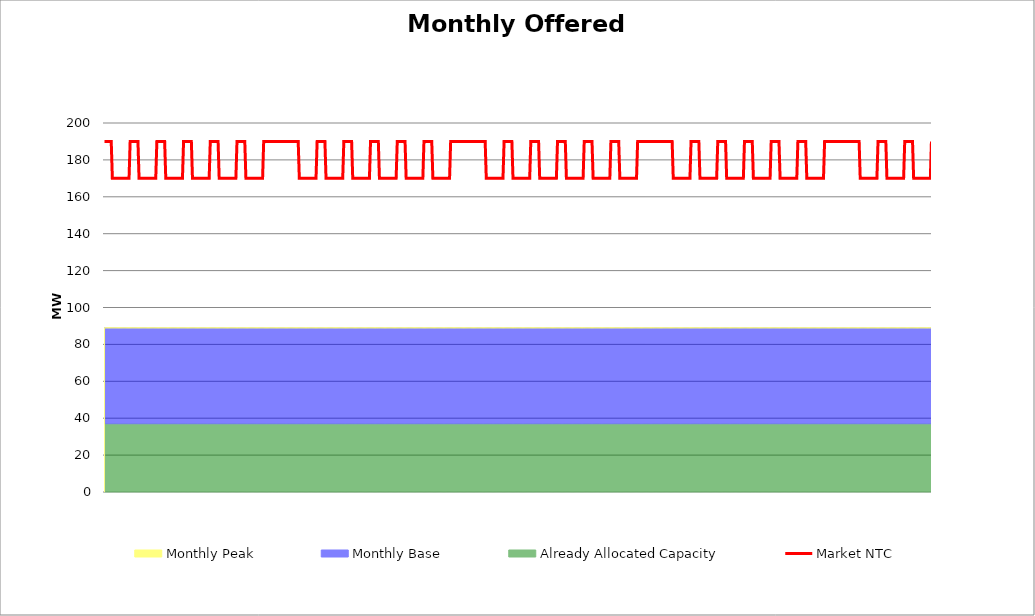
| Category | Market NTC |
|---|---|
| 0 | 190 |
| 1 | 190 |
| 2 | 190 |
| 3 | 190 |
| 4 | 190 |
| 5 | 190 |
| 6 | 190 |
| 7 | 170 |
| 8 | 170 |
| 9 | 170 |
| 10 | 170 |
| 11 | 170 |
| 12 | 170 |
| 13 | 170 |
| 14 | 170 |
| 15 | 170 |
| 16 | 170 |
| 17 | 170 |
| 18 | 170 |
| 19 | 170 |
| 20 | 170 |
| 21 | 170 |
| 22 | 170 |
| 23 | 190 |
| 24 | 190 |
| 25 | 190 |
| 26 | 190 |
| 27 | 190 |
| 28 | 190 |
| 29 | 190 |
| 30 | 190 |
| 31 | 170 |
| 32 | 170 |
| 33 | 170 |
| 34 | 170 |
| 35 | 170 |
| 36 | 170 |
| 37 | 170 |
| 38 | 170 |
| 39 | 170 |
| 40 | 170 |
| 41 | 170 |
| 42 | 170 |
| 43 | 170 |
| 44 | 170 |
| 45 | 170 |
| 46 | 170 |
| 47 | 190 |
| 48 | 190 |
| 49 | 190 |
| 50 | 190 |
| 51 | 190 |
| 52 | 190 |
| 53 | 190 |
| 54 | 190 |
| 55 | 170 |
| 56 | 170 |
| 57 | 170 |
| 58 | 170 |
| 59 | 170 |
| 60 | 170 |
| 61 | 170 |
| 62 | 170 |
| 63 | 170 |
| 64 | 170 |
| 65 | 170 |
| 66 | 170 |
| 67 | 170 |
| 68 | 170 |
| 69 | 170 |
| 70 | 170 |
| 71 | 190 |
| 72 | 190 |
| 73 | 190 |
| 74 | 190 |
| 75 | 190 |
| 76 | 190 |
| 77 | 190 |
| 78 | 190 |
| 79 | 170 |
| 80 | 170 |
| 81 | 170 |
| 82 | 170 |
| 83 | 170 |
| 84 | 170 |
| 85 | 170 |
| 86 | 170 |
| 87 | 170 |
| 88 | 170 |
| 89 | 170 |
| 90 | 170 |
| 91 | 170 |
| 92 | 170 |
| 93 | 170 |
| 94 | 170 |
| 95 | 190 |
| 96 | 190 |
| 97 | 190 |
| 98 | 190 |
| 99 | 190 |
| 100 | 190 |
| 101 | 190 |
| 102 | 190 |
| 103 | 170 |
| 104 | 170 |
| 105 | 170 |
| 106 | 170 |
| 107 | 170 |
| 108 | 170 |
| 109 | 170 |
| 110 | 170 |
| 111 | 170 |
| 112 | 170 |
| 113 | 170 |
| 114 | 170 |
| 115 | 170 |
| 116 | 170 |
| 117 | 170 |
| 118 | 170 |
| 119 | 190 |
| 120 | 190 |
| 121 | 190 |
| 122 | 190 |
| 123 | 190 |
| 124 | 190 |
| 125 | 190 |
| 126 | 190 |
| 127 | 170 |
| 128 | 170 |
| 129 | 170 |
| 130 | 170 |
| 131 | 170 |
| 132 | 170 |
| 133 | 170 |
| 134 | 170 |
| 135 | 170 |
| 136 | 170 |
| 137 | 170 |
| 138 | 170 |
| 139 | 170 |
| 140 | 170 |
| 141 | 170 |
| 142 | 170 |
| 143 | 190 |
| 144 | 190 |
| 145 | 190 |
| 146 | 190 |
| 147 | 190 |
| 148 | 190 |
| 149 | 190 |
| 150 | 190 |
| 151 | 190 |
| 152 | 190 |
| 153 | 190 |
| 154 | 190 |
| 155 | 190 |
| 156 | 190 |
| 157 | 190 |
| 158 | 190 |
| 159 | 190 |
| 160 | 190 |
| 161 | 190 |
| 162 | 190 |
| 163 | 190 |
| 164 | 190 |
| 165 | 190 |
| 166 | 190 |
| 167 | 190 |
| 168 | 190 |
| 169 | 190 |
| 170 | 190 |
| 171 | 190 |
| 172 | 190 |
| 173 | 190 |
| 174 | 190 |
| 175 | 170 |
| 176 | 170 |
| 177 | 170 |
| 178 | 170 |
| 179 | 170 |
| 180 | 170 |
| 181 | 170 |
| 182 | 170 |
| 183 | 170 |
| 184 | 170 |
| 185 | 170 |
| 186 | 170 |
| 187 | 170 |
| 188 | 170 |
| 189 | 170 |
| 190 | 170 |
| 191 | 190 |
| 192 | 190 |
| 193 | 190 |
| 194 | 190 |
| 195 | 190 |
| 196 | 190 |
| 197 | 190 |
| 198 | 190 |
| 199 | 170 |
| 200 | 170 |
| 201 | 170 |
| 202 | 170 |
| 203 | 170 |
| 204 | 170 |
| 205 | 170 |
| 206 | 170 |
| 207 | 170 |
| 208 | 170 |
| 209 | 170 |
| 210 | 170 |
| 211 | 170 |
| 212 | 170 |
| 213 | 170 |
| 214 | 170 |
| 215 | 190 |
| 216 | 190 |
| 217 | 190 |
| 218 | 190 |
| 219 | 190 |
| 220 | 190 |
| 221 | 190 |
| 222 | 190 |
| 223 | 170 |
| 224 | 170 |
| 225 | 170 |
| 226 | 170 |
| 227 | 170 |
| 228 | 170 |
| 229 | 170 |
| 230 | 170 |
| 231 | 170 |
| 232 | 170 |
| 233 | 170 |
| 234 | 170 |
| 235 | 170 |
| 236 | 170 |
| 237 | 170 |
| 238 | 170 |
| 239 | 190 |
| 240 | 190 |
| 241 | 190 |
| 242 | 190 |
| 243 | 190 |
| 244 | 190 |
| 245 | 190 |
| 246 | 190 |
| 247 | 170 |
| 248 | 170 |
| 249 | 170 |
| 250 | 170 |
| 251 | 170 |
| 252 | 170 |
| 253 | 170 |
| 254 | 170 |
| 255 | 170 |
| 256 | 170 |
| 257 | 170 |
| 258 | 170 |
| 259 | 170 |
| 260 | 170 |
| 261 | 170 |
| 262 | 170 |
| 263 | 190 |
| 264 | 190 |
| 265 | 190 |
| 266 | 190 |
| 267 | 190 |
| 268 | 190 |
| 269 | 190 |
| 270 | 190 |
| 271 | 170 |
| 272 | 170 |
| 273 | 170 |
| 274 | 170 |
| 275 | 170 |
| 276 | 170 |
| 277 | 170 |
| 278 | 170 |
| 279 | 170 |
| 280 | 170 |
| 281 | 170 |
| 282 | 170 |
| 283 | 170 |
| 284 | 170 |
| 285 | 170 |
| 286 | 170 |
| 287 | 190 |
| 288 | 190 |
| 289 | 190 |
| 290 | 190 |
| 291 | 190 |
| 292 | 190 |
| 293 | 190 |
| 294 | 190 |
| 295 | 170 |
| 296 | 170 |
| 297 | 170 |
| 298 | 170 |
| 299 | 170 |
| 300 | 170 |
| 301 | 170 |
| 302 | 170 |
| 303 | 170 |
| 304 | 170 |
| 305 | 170 |
| 306 | 170 |
| 307 | 170 |
| 308 | 170 |
| 309 | 170 |
| 310 | 170 |
| 311 | 190 |
| 312 | 190 |
| 313 | 190 |
| 314 | 190 |
| 315 | 190 |
| 316 | 190 |
| 317 | 190 |
| 318 | 190 |
| 319 | 190 |
| 320 | 190 |
| 321 | 190 |
| 322 | 190 |
| 323 | 190 |
| 324 | 190 |
| 325 | 190 |
| 326 | 190 |
| 327 | 190 |
| 328 | 190 |
| 329 | 190 |
| 330 | 190 |
| 331 | 190 |
| 332 | 190 |
| 333 | 190 |
| 334 | 190 |
| 335 | 190 |
| 336 | 190 |
| 337 | 190 |
| 338 | 190 |
| 339 | 190 |
| 340 | 190 |
| 341 | 190 |
| 342 | 190 |
| 343 | 170 |
| 344 | 170 |
| 345 | 170 |
| 346 | 170 |
| 347 | 170 |
| 348 | 170 |
| 349 | 170 |
| 350 | 170 |
| 351 | 170 |
| 352 | 170 |
| 353 | 170 |
| 354 | 170 |
| 355 | 170 |
| 356 | 170 |
| 357 | 170 |
| 358 | 170 |
| 359 | 190 |
| 360 | 190 |
| 361 | 190 |
| 362 | 190 |
| 363 | 190 |
| 364 | 190 |
| 365 | 190 |
| 366 | 190 |
| 367 | 170 |
| 368 | 170 |
| 369 | 170 |
| 370 | 170 |
| 371 | 170 |
| 372 | 170 |
| 373 | 170 |
| 374 | 170 |
| 375 | 170 |
| 376 | 170 |
| 377 | 170 |
| 378 | 170 |
| 379 | 170 |
| 380 | 170 |
| 381 | 170 |
| 382 | 170 |
| 383 | 190 |
| 384 | 190 |
| 385 | 190 |
| 386 | 190 |
| 387 | 190 |
| 388 | 190 |
| 389 | 190 |
| 390 | 190 |
| 391 | 170 |
| 392 | 170 |
| 393 | 170 |
| 394 | 170 |
| 395 | 170 |
| 396 | 170 |
| 397 | 170 |
| 398 | 170 |
| 399 | 170 |
| 400 | 170 |
| 401 | 170 |
| 402 | 170 |
| 403 | 170 |
| 404 | 170 |
| 405 | 170 |
| 406 | 170 |
| 407 | 190 |
| 408 | 190 |
| 409 | 190 |
| 410 | 190 |
| 411 | 190 |
| 412 | 190 |
| 413 | 190 |
| 414 | 190 |
| 415 | 170 |
| 416 | 170 |
| 417 | 170 |
| 418 | 170 |
| 419 | 170 |
| 420 | 170 |
| 421 | 170 |
| 422 | 170 |
| 423 | 170 |
| 424 | 170 |
| 425 | 170 |
| 426 | 170 |
| 427 | 170 |
| 428 | 170 |
| 429 | 170 |
| 430 | 170 |
| 431 | 190 |
| 432 | 190 |
| 433 | 190 |
| 434 | 190 |
| 435 | 190 |
| 436 | 190 |
| 437 | 190 |
| 438 | 190 |
| 439 | 170 |
| 440 | 170 |
| 441 | 170 |
| 442 | 170 |
| 443 | 170 |
| 444 | 170 |
| 445 | 170 |
| 446 | 170 |
| 447 | 170 |
| 448 | 170 |
| 449 | 170 |
| 450 | 170 |
| 451 | 170 |
| 452 | 170 |
| 453 | 170 |
| 454 | 170 |
| 455 | 190 |
| 456 | 190 |
| 457 | 190 |
| 458 | 190 |
| 459 | 190 |
| 460 | 190 |
| 461 | 190 |
| 462 | 190 |
| 463 | 170 |
| 464 | 170 |
| 465 | 170 |
| 466 | 170 |
| 467 | 170 |
| 468 | 170 |
| 469 | 170 |
| 470 | 170 |
| 471 | 170 |
| 472 | 170 |
| 473 | 170 |
| 474 | 170 |
| 475 | 170 |
| 476 | 170 |
| 477 | 170 |
| 478 | 170 |
| 479 | 190 |
| 480 | 190 |
| 481 | 190 |
| 482 | 190 |
| 483 | 190 |
| 484 | 190 |
| 485 | 190 |
| 486 | 190 |
| 487 | 190 |
| 488 | 190 |
| 489 | 190 |
| 490 | 190 |
| 491 | 190 |
| 492 | 190 |
| 493 | 190 |
| 494 | 190 |
| 495 | 190 |
| 496 | 190 |
| 497 | 190 |
| 498 | 190 |
| 499 | 190 |
| 500 | 190 |
| 501 | 190 |
| 502 | 190 |
| 503 | 190 |
| 504 | 190 |
| 505 | 190 |
| 506 | 190 |
| 507 | 190 |
| 508 | 190 |
| 509 | 190 |
| 510 | 190 |
| 511 | 170 |
| 512 | 170 |
| 513 | 170 |
| 514 | 170 |
| 515 | 170 |
| 516 | 170 |
| 517 | 170 |
| 518 | 170 |
| 519 | 170 |
| 520 | 170 |
| 521 | 170 |
| 522 | 170 |
| 523 | 170 |
| 524 | 170 |
| 525 | 170 |
| 526 | 170 |
| 527 | 190 |
| 528 | 190 |
| 529 | 190 |
| 530 | 190 |
| 531 | 190 |
| 532 | 190 |
| 533 | 190 |
| 534 | 190 |
| 535 | 170 |
| 536 | 170 |
| 537 | 170 |
| 538 | 170 |
| 539 | 170 |
| 540 | 170 |
| 541 | 170 |
| 542 | 170 |
| 543 | 170 |
| 544 | 170 |
| 545 | 170 |
| 546 | 170 |
| 547 | 170 |
| 548 | 170 |
| 549 | 170 |
| 550 | 170 |
| 551 | 190 |
| 552 | 190 |
| 553 | 190 |
| 554 | 190 |
| 555 | 190 |
| 556 | 190 |
| 557 | 190 |
| 558 | 190 |
| 559 | 170 |
| 560 | 170 |
| 561 | 170 |
| 562 | 170 |
| 563 | 170 |
| 564 | 170 |
| 565 | 170 |
| 566 | 170 |
| 567 | 170 |
| 568 | 170 |
| 569 | 170 |
| 570 | 170 |
| 571 | 170 |
| 572 | 170 |
| 573 | 170 |
| 574 | 170 |
| 575 | 190 |
| 576 | 190 |
| 577 | 190 |
| 578 | 190 |
| 579 | 190 |
| 580 | 190 |
| 581 | 190 |
| 582 | 190 |
| 583 | 170 |
| 584 | 170 |
| 585 | 170 |
| 586 | 170 |
| 587 | 170 |
| 588 | 170 |
| 589 | 170 |
| 590 | 170 |
| 591 | 170 |
| 592 | 170 |
| 593 | 170 |
| 594 | 170 |
| 595 | 170 |
| 596 | 170 |
| 597 | 170 |
| 598 | 170 |
| 599 | 190 |
| 600 | 190 |
| 601 | 190 |
| 602 | 190 |
| 603 | 190 |
| 604 | 190 |
| 605 | 190 |
| 606 | 190 |
| 607 | 170 |
| 608 | 170 |
| 609 | 170 |
| 610 | 170 |
| 611 | 170 |
| 612 | 170 |
| 613 | 170 |
| 614 | 170 |
| 615 | 170 |
| 616 | 170 |
| 617 | 170 |
| 618 | 170 |
| 619 | 170 |
| 620 | 170 |
| 621 | 170 |
| 622 | 170 |
| 623 | 190 |
| 624 | 190 |
| 625 | 190 |
| 626 | 190 |
| 627 | 190 |
| 628 | 190 |
| 629 | 190 |
| 630 | 190 |
| 631 | 170 |
| 632 | 170 |
| 633 | 170 |
| 634 | 170 |
| 635 | 170 |
| 636 | 170 |
| 637 | 170 |
| 638 | 170 |
| 639 | 170 |
| 640 | 170 |
| 641 | 170 |
| 642 | 170 |
| 643 | 170 |
| 644 | 170 |
| 645 | 170 |
| 646 | 170 |
| 647 | 190 |
| 648 | 190 |
| 649 | 190 |
| 650 | 190 |
| 651 | 190 |
| 652 | 190 |
| 653 | 190 |
| 654 | 190 |
| 655 | 190 |
| 656 | 190 |
| 657 | 190 |
| 658 | 190 |
| 659 | 190 |
| 660 | 190 |
| 661 | 190 |
| 662 | 190 |
| 663 | 190 |
| 664 | 190 |
| 665 | 190 |
| 666 | 190 |
| 667 | 190 |
| 668 | 190 |
| 669 | 190 |
| 670 | 190 |
| 671 | 190 |
| 672 | 190 |
| 673 | 190 |
| 674 | 190 |
| 675 | 190 |
| 676 | 190 |
| 677 | 190 |
| 678 | 190 |
| 679 | 170 |
| 680 | 170 |
| 681 | 170 |
| 682 | 170 |
| 683 | 170 |
| 684 | 170 |
| 685 | 170 |
| 686 | 170 |
| 687 | 170 |
| 688 | 170 |
| 689 | 170 |
| 690 | 170 |
| 691 | 170 |
| 692 | 170 |
| 693 | 170 |
| 694 | 170 |
| 695 | 190 |
| 696 | 190 |
| 697 | 190 |
| 698 | 190 |
| 699 | 190 |
| 700 | 190 |
| 701 | 190 |
| 702 | 190 |
| 703 | 170 |
| 704 | 170 |
| 705 | 170 |
| 706 | 170 |
| 707 | 170 |
| 708 | 170 |
| 709 | 170 |
| 710 | 170 |
| 711 | 170 |
| 712 | 170 |
| 713 | 170 |
| 714 | 170 |
| 715 | 170 |
| 716 | 170 |
| 717 | 170 |
| 718 | 170 |
| 719 | 190 |
| 720 | 190 |
| 721 | 190 |
| 722 | 190 |
| 723 | 190 |
| 724 | 190 |
| 725 | 190 |
| 726 | 190 |
| 727 | 170 |
| 728 | 170 |
| 729 | 170 |
| 730 | 170 |
| 731 | 170 |
| 732 | 170 |
| 733 | 170 |
| 734 | 170 |
| 735 | 170 |
| 736 | 170 |
| 737 | 170 |
| 738 | 170 |
| 739 | 170 |
| 740 | 170 |
| 741 | 170 |
| 742 | 170 |
| 743 | 190 |